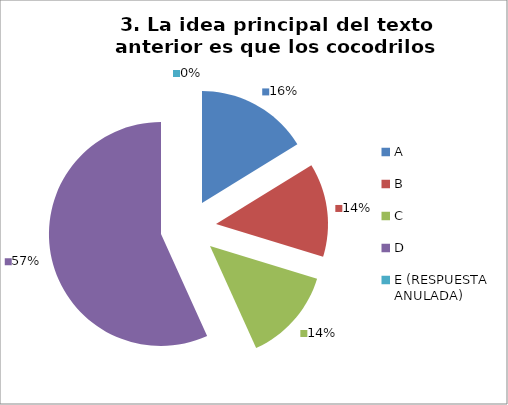
| Category | CANTIDAD DE RESPUESTAS PREGUNTA (3) | PORCENTAJE |
|---|---|---|
| A | 6 | 0.162 |
| B | 5 | 0.135 |
| C | 5 | 0.135 |
| D | 21 | 0.568 |
| E (RESPUESTA ANULADA) | 0 | 0 |